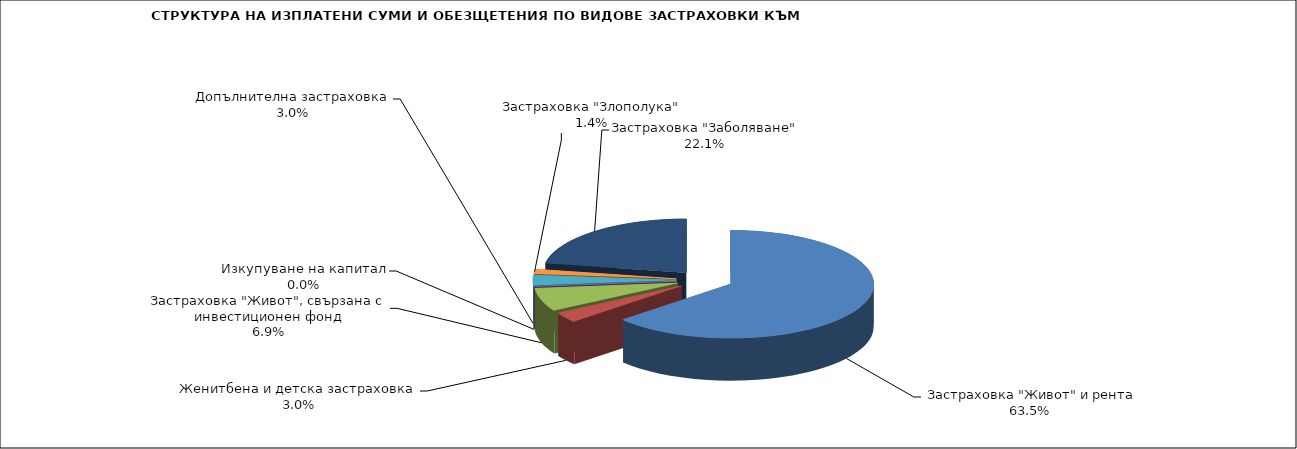
| Category |  Застраховка "Живот" и рента |
|---|---|
|  Застраховка "Живот" и рента | 112828459.56 |
| Женитбена и детска застраховка | 5355494.096 |
| Застраховка "Живот", свързана с инвестиционен фонд | 12303032.895 |
| Изкупуване на капитал | 0 |
| Допълнителна застраховка | 5390301.665 |
| Застраховка "Злополука" | 2478775.838 |
| Застраховка "Заболяване" | 39363844.103 |